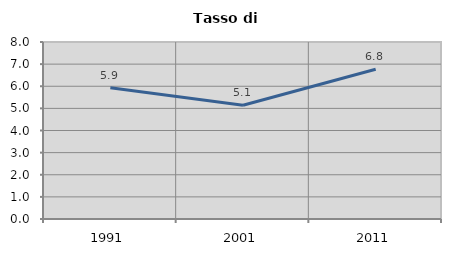
| Category | Tasso di disoccupazione   |
|---|---|
| 1991.0 | 5.928 |
| 2001.0 | 5.139 |
| 2011.0 | 6.77 |